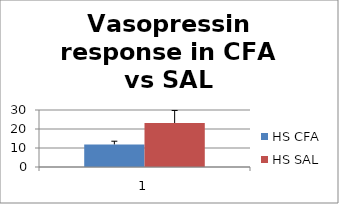
| Category | HS CFA | HS SAL |
|---|---|---|
| 0 | 11.873 | 23.15 |